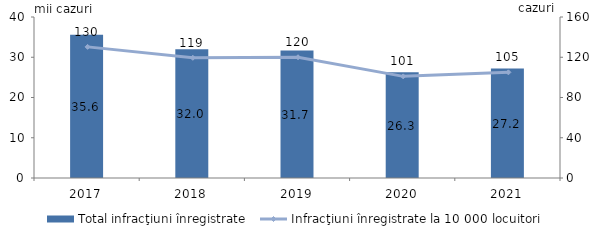
| Category | Total infracţiuni înregistrate |
|---|---|
| 2017.0 | 35.58 |
| 2018.0 | 32 |
| 2019.0 | 31.7 |
| 2020.0 | 26.3 |
| 2021.0 | 27.2 |